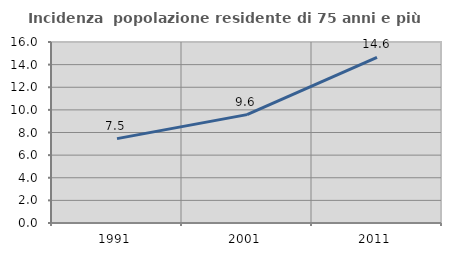
| Category | Incidenza  popolazione residente di 75 anni e più |
|---|---|
| 1991.0 | 7.457 |
| 2001.0 | 9.579 |
| 2011.0 | 14.646 |